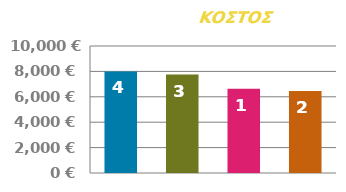
| Category | ΠΡΟΚΑΤΑΒΟΛΗ |
|---|---|
| 0 | 8000 |
| 1 | 7750 |
| 2 | 6625 |
| 3 | 6450 |